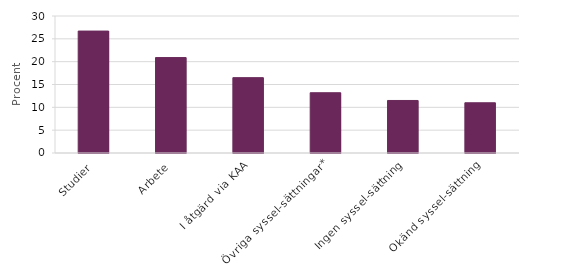
| Category | Series 0 |
|---|---|
| Studier | 26.7 |
| Arbete | 20.9 |
| I åtgärd via KAA | 16.5 |
| Övriga syssel-sättningar* | 13.2 |
| Ingen syssel-sättning | 11.5 |
| Okänd syssel-sättning | 11 |